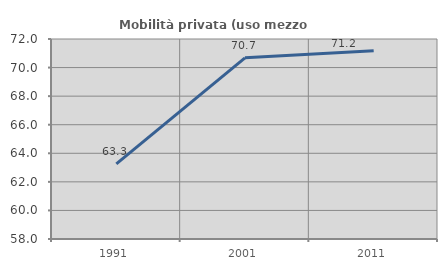
| Category | Mobilità privata (uso mezzo privato) |
|---|---|
| 1991.0 | 63.256 |
| 2001.0 | 70.684 |
| 2011.0 | 71.182 |